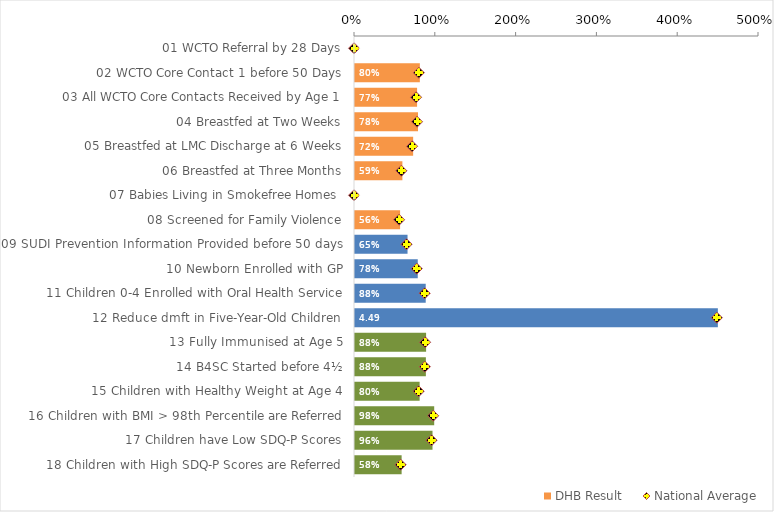
| Category | DHB Result |
|---|---|
| 01 WCTO Referral by 28 Days | 0 |
| 02 WCTO Core Contact 1 before 50 Days | 0.803 |
| 03 All WCTO Core Contacts Received by Age 1 | 0.768 |
| 04 Breastfed at Two Weeks | 0.78 |
| 05 Breastfed at LMC Discharge at 6 Weeks | 0.72 |
| 06 Breastfed at Three Months | 0.587 |
| 07 Babies Living in Smokefree Homes  | 0 |
| 08 Screened for Family Violence | 0.558 |
| 09 SUDI Prevention Information Provided before 50 days | 0.65 |
| 10 Newborn Enrolled with GP | 0.777 |
| 11 Children 0-4 Enrolled with Oral Health Service | 0.875 |
| 12 Reduce dmft in Five-Year-Old Children | 4.491 |
| 13 Fully Immunised at Age 5 | 0.88 |
| 14 B4SC Started before 4½ | 0.877 |
| 15 Children with Healthy Weight at Age 4 | 0.8 |
| 16 Children with BMI > 98th Percentile are Referred | 0.98 |
| 17 Children have Low SDQ-P Scores | 0.959 |
| 18 Children with High SDQ-P Scores are Referred | 0.577 |